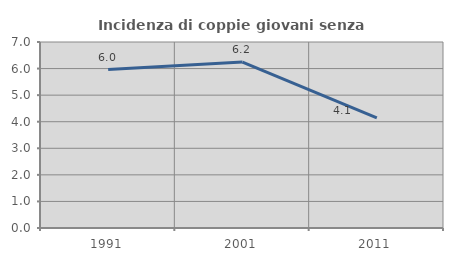
| Category | Incidenza di coppie giovani senza figli |
|---|---|
| 1991.0 | 5.963 |
| 2001.0 | 6.245 |
| 2011.0 | 4.142 |